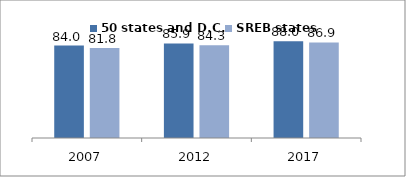
| Category | 50 states and D.C. | SREB states |
|---|---|---|
| 2007.0 | 84.028 | 81.817 |
| 2012.0 | 85.95 | 84.251 |
| 2017.0 | 87.985 | 86.86 |